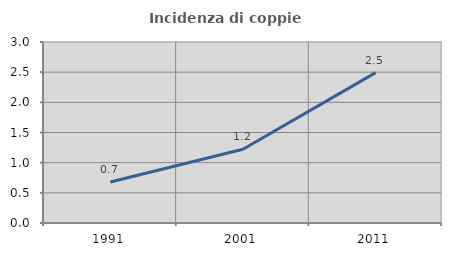
| Category | Incidenza di coppie miste |
|---|---|
| 1991.0 | 0.68 |
| 2001.0 | 1.223 |
| 2011.0 | 2.493 |